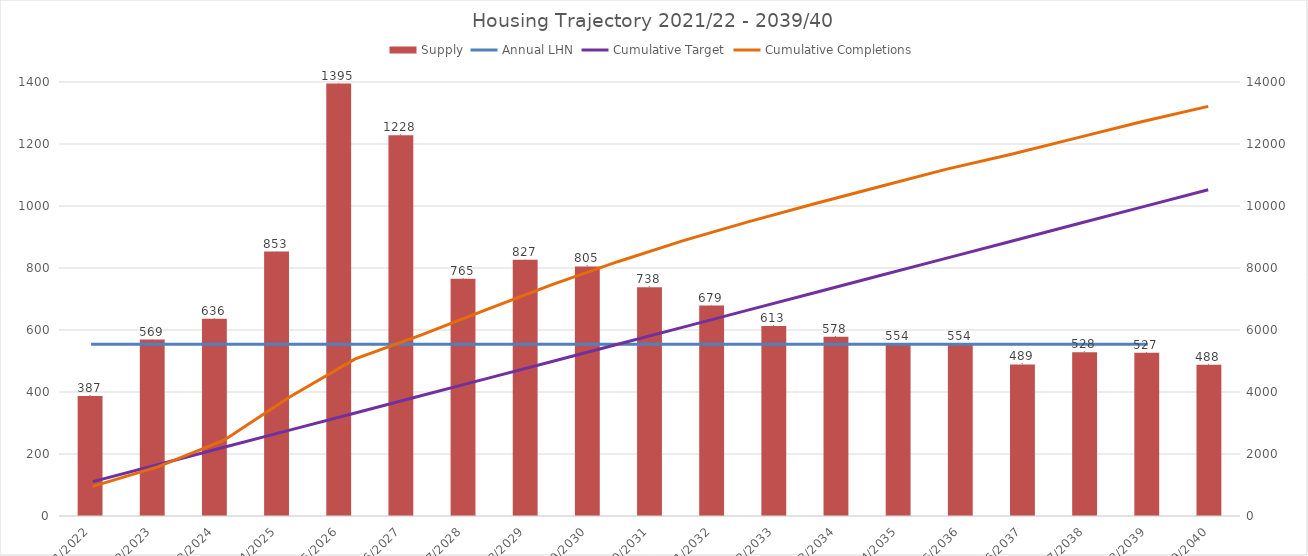
| Category | Supply |
|---|---|
| 2021/2022 | 387 |
| 2022/2023 | 569 |
| 2023/2024 | 636 |
| 2024/2025 | 853 |
| 2025/2026 | 1395 |
| 2026/2027 | 1228 |
| 2027/2028 | 765 |
| 2028/2029 | 827 |
| 2029/2030 | 805 |
| 2030/2031 | 738 |
| 2031/2032 | 679 |
| 2032/2033 | 613 |
| 2033/2034 | 578 |
| 2034/2035 | 554 |
| 2035/2036 | 554 |
| 2036/2037 | 489 |
| 2037/2038 | 528 |
| 2038/2039 | 527 |
| 2039/2040 | 488 |